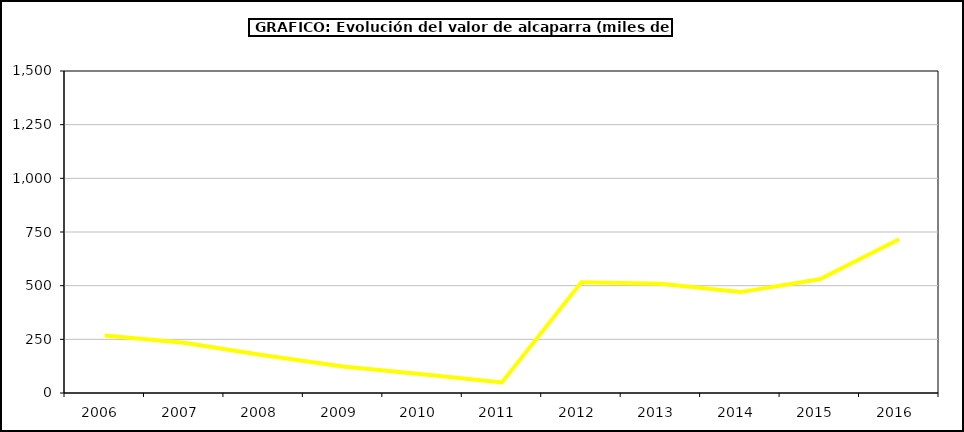
| Category | producción |
|---|---|
| 2006.0 | 268.2 |
| 2007.0 | 233.651 |
| 2008.0 | 175.54 |
| 2009.0 | 123.08 |
| 2010.0 | 87.75 |
| 2011.0 | 49.5 |
| 2012.0 | 516 |
| 2013.0 | 508.5 |
| 2014.0 | 470 |
| 2015.0 | 530 |
| 2016.0 | 716 |